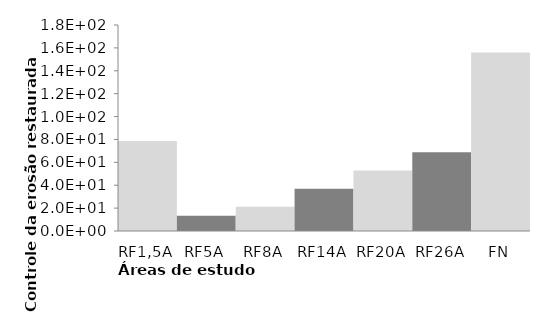
| Category | Series 0 |
|---|---|
| RF1,5A | 78.545 |
| RF5A | 13.217 |
| RF8A | 21.147 |
| RF14A | 37.007 |
| RF20A | 52.867 |
| RF26A | 68.727 |
| FN | 156 |